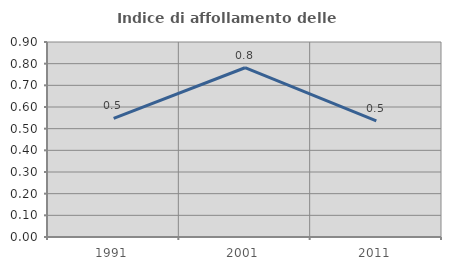
| Category | Indice di affollamento delle abitazioni  |
|---|---|
| 1991.0 | 0.548 |
| 2001.0 | 0.781 |
| 2011.0 | 0.536 |